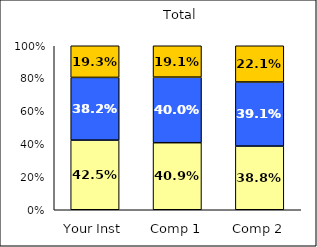
| Category | Low College Reputation Orientation | Average College Reputation Orientation | High College Reputation Orientation |
|---|---|---|---|
| Your Inst | 0.425 | 0.382 | 0.193 |
| Comp 1 | 0.409 | 0.4 | 0.191 |
| Comp 2 | 0.388 | 0.391 | 0.221 |